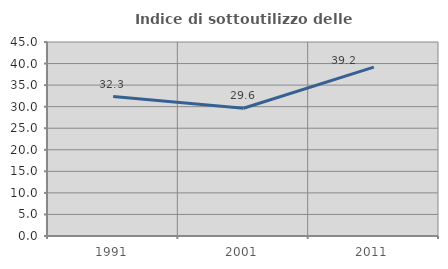
| Category | Indice di sottoutilizzo delle abitazioni  |
|---|---|
| 1991.0 | 32.34 |
| 2001.0 | 29.644 |
| 2011.0 | 39.179 |